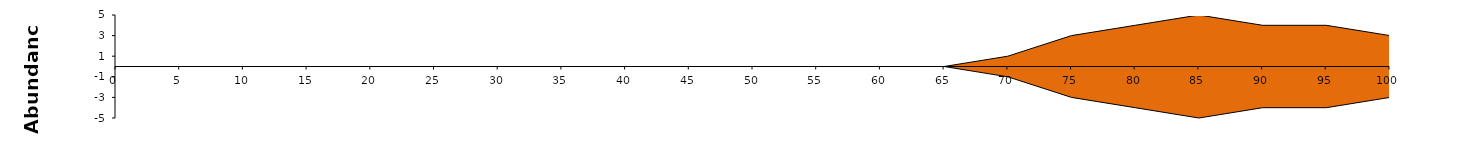
| Category | Series1 | Series2 |
|---|---|---|
| 0.0 | 0 | 0 |
| 5.0 | 0 | 0 |
| 10.0 | 0 | 0 |
| 15.0 | 0 | 0 |
| 20.0 | 0 | 0 |
| 25.0 | 0 | 0 |
| 30.0 | 0 | 0 |
| 35.0 | 0 | 0 |
| 40.0 | 0 | 0 |
| 45.0 | 0 | 0 |
| 50.0 | 0 | 0 |
| 55.0 | 0 | 0 |
| 60.0 | 0 | 0 |
| 65.0 | 0 | 0 |
| 70.0 | 1 | -1 |
| 75.0 | 3 | -3 |
| 80.0 | 4 | -4 |
| 85.0 | 5 | -5 |
| 90.0 | 4 | -4 |
| 95.0 | 4 | -4 |
| 100.0 | 3 | -3 |